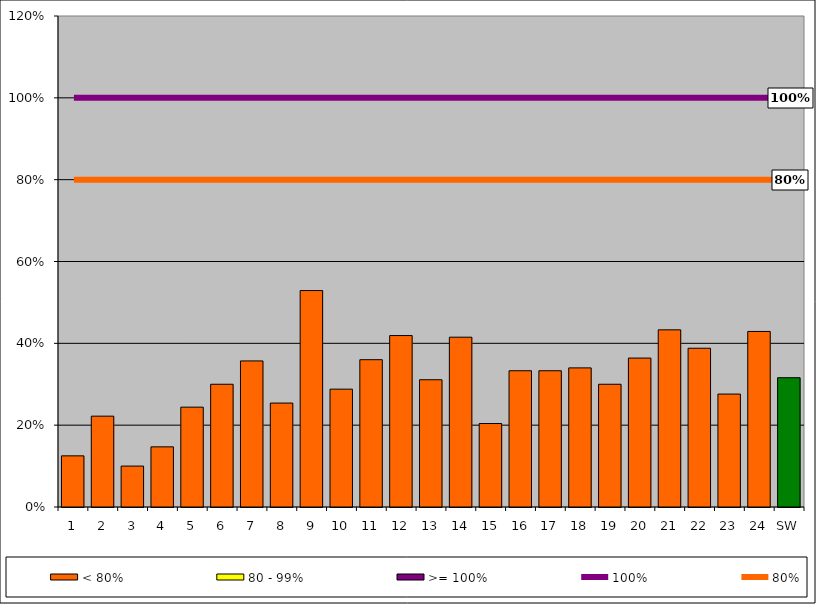
| Category | < 80% | 80 - 99% | >= 100% |
|---|---|---|---|
| 1 | 0.125 | 0 | 0 |
| 2 | 0.222 | 0 | 0 |
| 3 | 0.1 | 0 | 0 |
| 4 | 0.147 | 0 | 0 |
| 5 | 0.244 | 0 | 0 |
| 6 | 0.3 | 0 | 0 |
| 7 | 0.357 | 0 | 0 |
| 8 | 0.254 | 0 | 0 |
| 9 | 0.529 | 0 | 0 |
| 10 | 0.288 | 0 | 0 |
| 11 | 0.36 | 0 | 0 |
| 12 | 0.419 | 0 | 0 |
| 13 | 0.311 | 0 | 0 |
| 14 | 0.415 | 0 | 0 |
| 15 | 0.204 | 0 | 0 |
| 16 | 0.333 | 0 | 0 |
| 17 | 0.333 | 0 | 0 |
| 18 | 0.34 | 0 | 0 |
| 19 | 0.3 | 0 | 0 |
| 20 | 0.364 | 0 | 0 |
| 21 | 0.433 | 0 | 0 |
| 22 | 0.388 | 0 | 0 |
| 23 | 0.276 | 0 | 0 |
| 24 | 0.429 | 0 | 0 |
| SW | 0.316 | 0 | 0 |